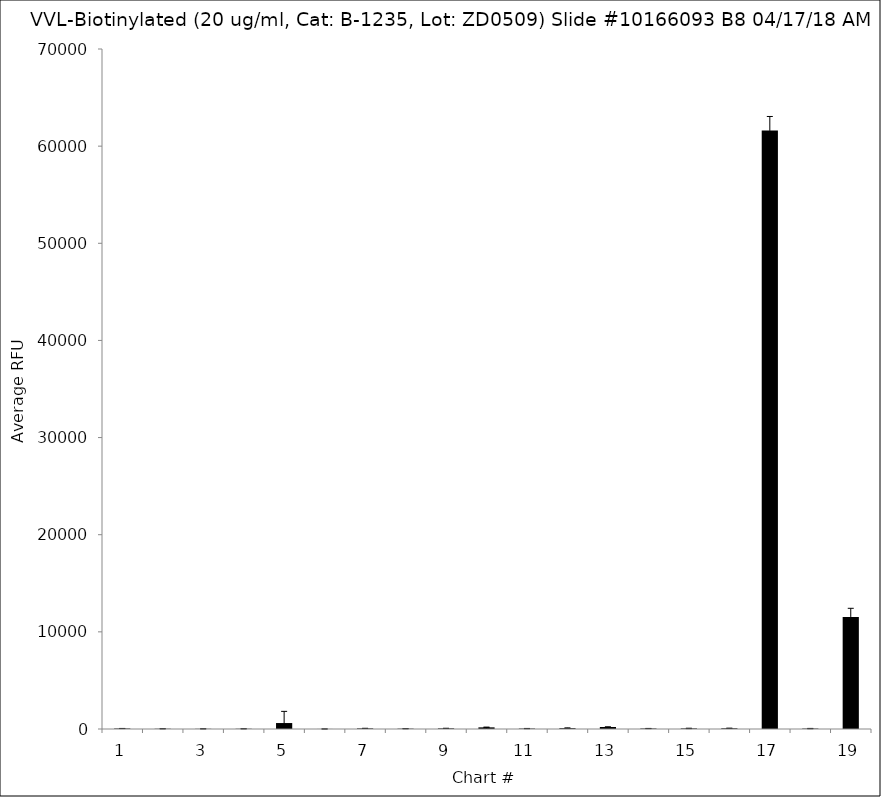
| Category | Series 0 |
|---|---|
| 1.0 | 50.5 |
| 2.0 | 24.75 |
| 3.0 | 18 |
| 4.0 | 23.25 |
| 5.0 | 613.5 |
| 6.0 | 5 |
| 7.0 | 61.75 |
| 8.0 | 33 |
| 9.0 | 63.75 |
| 10.0 | 169 |
| 11.0 | 43.5 |
| 12.0 | 84.5 |
| 13.0 | 203.5 |
| 14.0 | 49.75 |
| 15.0 | 60.25 |
| 16.0 | 71.75 |
| 17.0 | 61614 |
| 18.0 | 44 |
| 19.0 | 11536.5 |